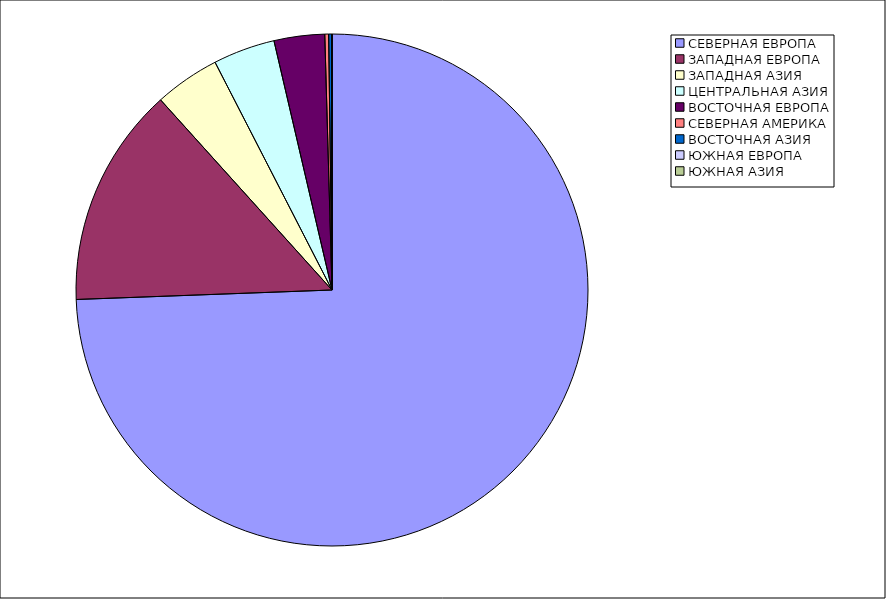
| Category | Оборот |
|---|---|
| СЕВЕРНАЯ ЕВРОПА | 74.409 |
| ЗАПАДНАЯ ЕВРОПА | 13.914 |
| ЗАПАДНАЯ АЗИЯ | 4.127 |
| ЦЕНТРАЛЬНАЯ АЗИЯ | 3.908 |
| ВОСТОЧНАЯ ЕВРОПА | 3.192 |
| СЕВЕРНАЯ АМЕРИКА | 0.242 |
| ВОСТОЧНАЯ АЗИЯ | 0.206 |
| ЮЖНАЯ ЕВРОПА | 0.002 |
| ЮЖНАЯ АЗИЯ | 0 |